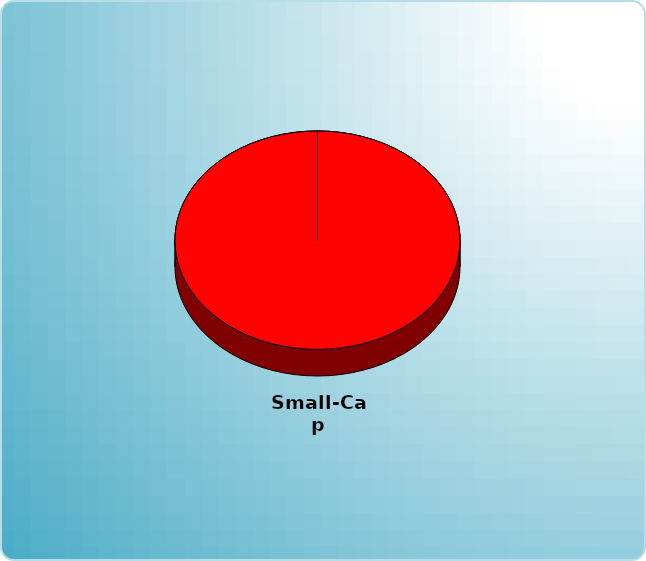
| Category | Series 0 |
|---|---|
| Cash | 0 |
| Bonds | 0 |
| Muni Bond | 0 |
| Hybrid bond | 0 |
| Value | 0 |
| Growth | 0 |
| Small-Cap | 6000 |
| Tangibles | 0 |
| International | 0 |
| Personal Property | 0 |
| Miscellaneous | 0 |